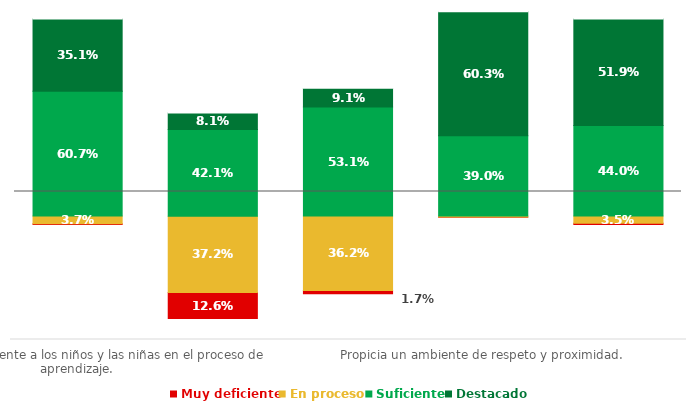
| Category |   | Muy deficiente | En proceso | Suficiente | Destacado |
|---|---|---|---|---|---|
| Involucra activamente a los niños y las niñas en el proceso de aprendizaje. | 0.041 | 0.004 | 0.037 | 0.607 | 0.351 |
| Promueve el razonamiento, la creatividad y/o el pensamiento crítico. | 0.498 | 0.126 | 0.372 | 0.421 | 0.081 |
| Evalúa el progreso de los aprendizajes para retroalimentar a los niños y las niñas y adecuar su enseñanza. | 0.378 | 0.017 | 0.362 | 0.531 | 0.091 |
| Propicia un ambiente de respeto y proximidad. | 0.006 | 0.002 | 0.004 | 0.39 | 0.603 |
| Regula positivamente el comportamiento de los niños y las niñas. | 0.041 | 0.006 | 0.035 | 0.44 | 0.519 |